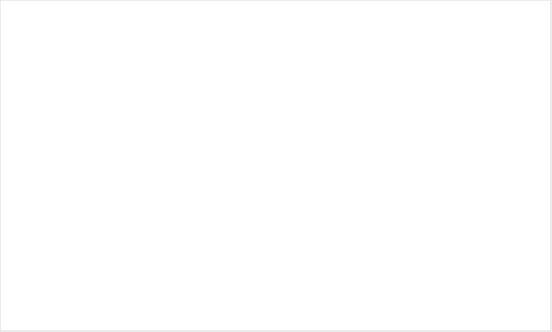
| Category | Pago principal  | Interés pagado  |
|---|---|---|
| 2020 | 444.931 | 314.753 |
| 2021 | 1241.601 | 820.398 |
| 2022 | 2083.21 | 1281.104 |
| 2023 | 2972.292 | 1694.338 |
| 2024 | 3911.526 | 2057.42 |
| 2025 | 4903.739 | 2367.521 |
| 2026 | 5951.921 | 2621.655 |
| 2027 | 7059.229 | 2816.662 |
| 2028 | 8228.998 | 2949.209 |
| 2029 | 9464.751 | 3015.771 |
| 2030 | 10000 | 3023.153 |